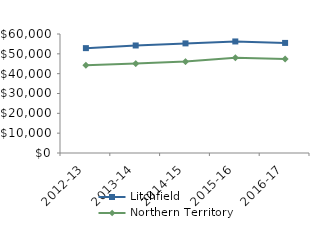
| Category | Litchfield | Northern Territory |
|---|---|---|
| 2012-13 | 52872.55 | 44232.02 |
| 2013-14 | 54216.05 | 45075.51 |
| 2014-15 | 55268.83 | 46083.65 |
| 2015-16 | 56242 | 48046.27 |
| 2016-17 | 55505.27 | 47367.05 |